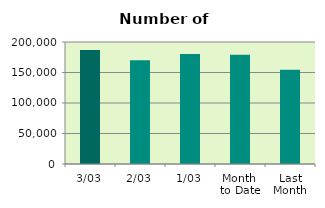
| Category | Series 0 |
|---|---|
| 3/03 | 186696 |
| 2/03 | 170064 |
| 1/03 | 180492 |
| Month 
to Date | 179084 |
| Last
Month | 154356.5 |